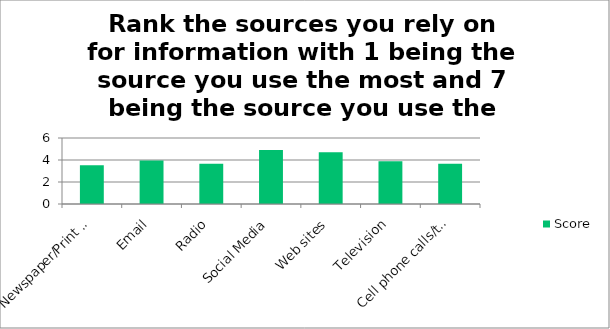
| Category | Score |
|---|---|
| Newspaper/Print materials | 3.52 |
| Email | 3.95 |
| Radio | 3.65 |
| Social Media | 4.9 |
| Web sites | 4.7 |
| Television | 3.89 |
| Cell phone calls/text messages | 3.65 |